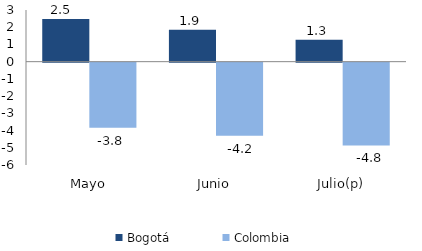
| Category | Bogotá | Colombia |
|---|---|---|
| Mayo | 2.473 | -3.777 |
| Junio | 1.858 | -4.237 |
| Julio(p) | 1.271 | -4.808 |